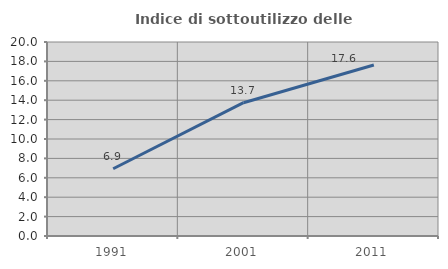
| Category | Indice di sottoutilizzo delle abitazioni  |
|---|---|
| 1991.0 | 6.929 |
| 2001.0 | 13.741 |
| 2011.0 | 17.624 |